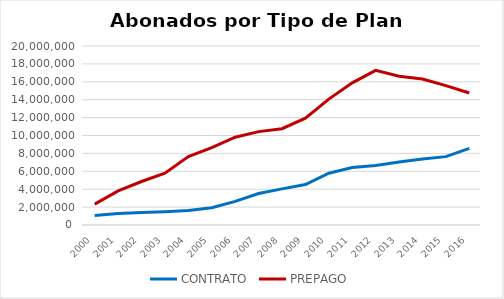
| Category | CONTRATO | PREPAGO |
|---|---|---|
| 2000.0 | 1068130 | 2333395 |
| 2001.0 | 1290852 | 3809931 |
| 2002.0 | 1382871 | 4861439 |
| 2003.0 | 1473310 | 5794971 |
| 2004.0 | 1616653 | 7644732 |
| 2005.0 | 1931459 | 8638113 |
| 2006.0 | 2644224 | 9806577 |
| 2007.0 | 3523166 | 10432036 |
| 2008.0 | 4033678 | 10762915 |
| 2009.0 | 4517200 | 11933023 |
| 2010.0 | 5786405 | 14065837 |
| 2011.0 | 6429681 | 15885567 |
| 2012.0 | 6657716 | 17283257 |
| 2013.0 | 7031350 | 16629989 |
| 2014.0 | 7375577 | 16305141 |
| 2015.0 | 7638385 | 15567968 |
| 2016.0 | 8556131 | 14746472 |